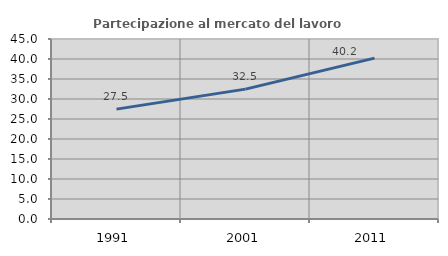
| Category | Partecipazione al mercato del lavoro  femminile |
|---|---|
| 1991.0 | 27.468 |
| 2001.0 | 32.466 |
| 2011.0 | 40.217 |